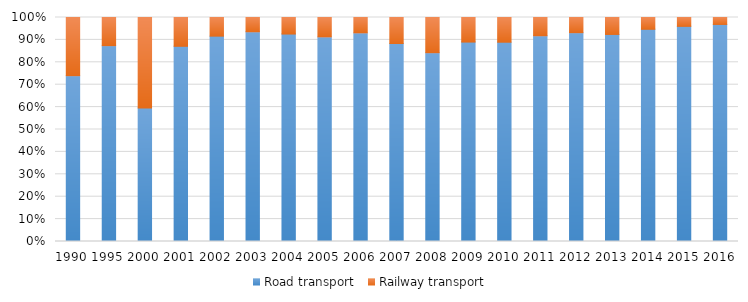
| Category | Road transport  | Railway transport  |
|---|---|---|
| 1990.0 | 0.74 | 0.26 |
| 1995.0 | 0.874 | 0.126 |
| 2000.0 | 0.596 | 0.404 |
| 2001.0 | 0.871 | 0.129 |
| 2002.0 | 0.917 | 0.083 |
| 2003.0 | 0.936 | 0.064 |
| 2004.0 | 0.926 | 0.074 |
| 2005.0 | 0.913 | 0.087 |
| 2006.0 | 0.931 | 0.069 |
| 2007.0 | 0.884 | 0.116 |
| 2008.0 | 0.843 | 0.157 |
| 2009.0 | 0.89 | 0.11 |
| 2010.0 | 0.89 | 0.11 |
| 2011.0 | 0.918 | 0.082 |
| 2012.0 | 0.932 | 0.068 |
| 2013.0 | 0.924 | 0.076 |
| 2014.0 | 0.947 | 0.053 |
| 2015.0 | 0.96 | 0.04 |
| 2016.0 | 0.969 | 0.031 |